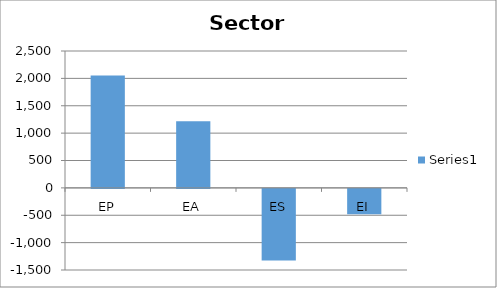
| Category | Series 0 |
|---|---|
| EP | 2053.671 |
| EA | 1218.496 |
| ES | -1309.559 |
| EI | -462.6 |